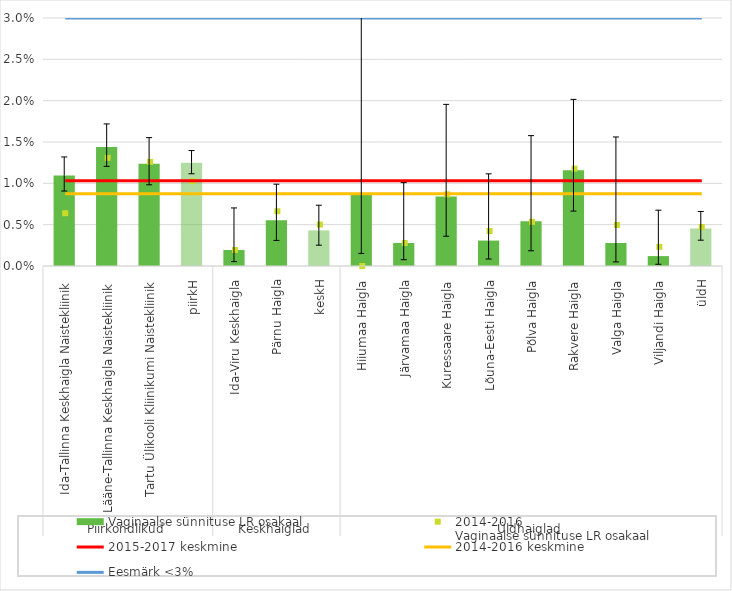
| Category | Vaginaalse sünnituse LR osakaal |
|---|---|
| 0 | 0.011 |
| 1 | 0.014 |
| 2 | 0.012 |
| 3 | 0.012 |
| 4 | 0.002 |
| 5 | 0.006 |
| 6 | 0.004 |
| 7 | 0.009 |
| 8 | 0.003 |
| 9 | 0.008 |
| 10 | 0.003 |
| 11 | 0.005 |
| 12 | 0.012 |
| 13 | 0.003 |
| 14 | 0.001 |
| 15 | 0.005 |